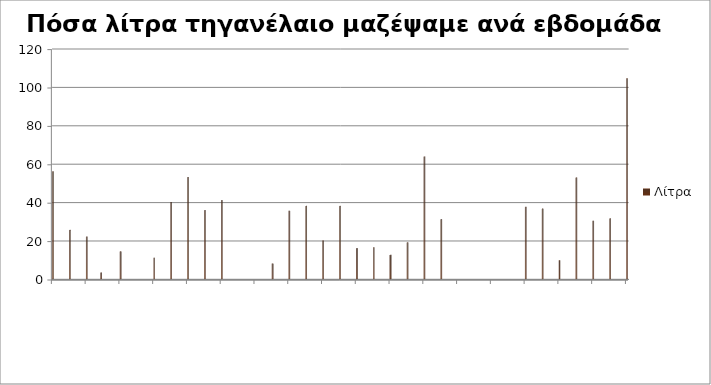
| Category | Λίτρα |
|---|---|
| 08/10/2014 | 55.99 |
| 15/10/2014 | 25.5 |
| 22/10/2014 | 22 |
| 28/10/2014 | 3.3 |
| 05/11/2014 | 14.3 |
| 19/11/2014 | 11 |
| 26/11/2014 | 40 |
| 03/12/2014 | 53.01 |
| 10/12/2014 | 35.8 |
| 17/12/2014 | 41 |
| 07/01/2015 | 8 |
| 14/01/2015 | 35.5 |
| 21/01/2015 | 38 |
| 28/01/2015 | 20 |
| 04/02/2015 | 38 |
| 11/02/2015 | 16 |
| 18/02/2015 | 16.5 |
| 25/02/2015 | 12.5 |
| 04/03/2015 | 19 |
| 11/03/2015 | 63.74 |
| 18/03/2015 | 31.1 |
| 22/04/2015 | 37.5 |
| 29/04/2015 | 36.59 |
| 06/05/2015 | 9.7 |
| 13/05/2015 | 52.75 |
| 20/05/2015 | 30.25 |
| 27/05/2015 | 31.5 |
| 03/06/2015 | 104.5 |